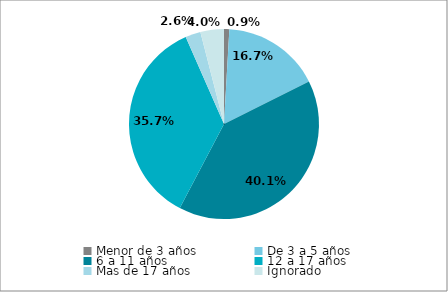
| Category | Menor de 3 años | Series 1 |
|---|---|---|
| Menor de 3 años | 0.009 | 0.009 |
| De 3 a 5 años | 0.167 | 0.167 |
| 6 a 11 años | 0.401 | 0.401 |
| 12 a 17 años | 0.357 | 0.357 |
| Mas de 17 años | 0.026 | 0.026 |
| Ignorado | 0.04 | 0.04 |